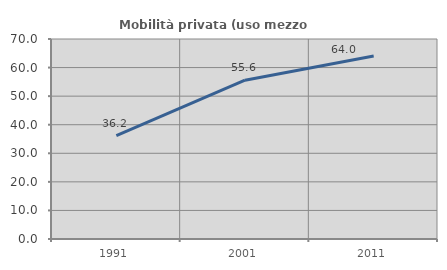
| Category | Mobilità privata (uso mezzo privato) |
|---|---|
| 1991.0 | 36.222 |
| 2001.0 | 55.569 |
| 2011.0 | 64.017 |